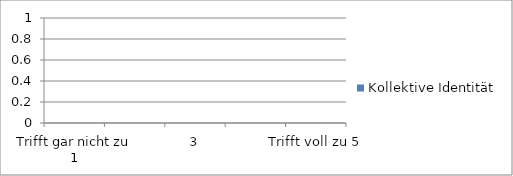
| Category | Kollektive Identität |
|---|---|
| Trifft gar nicht zu 1 | 0 |
| 2 | 0 |
| 3 | 0 |
| 4 | 0 |
| Trifft voll zu 5 | 0 |